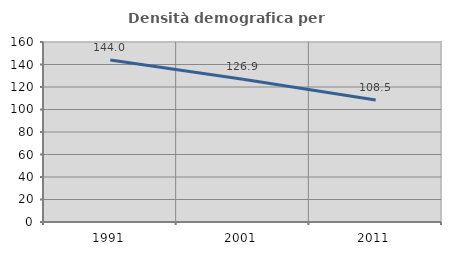
| Category | Densità demografica |
|---|---|
| 1991.0 | 144.012 |
| 2001.0 | 126.899 |
| 2011.0 | 108.502 |